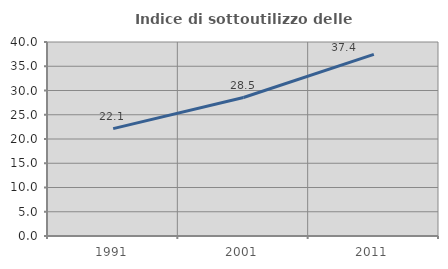
| Category | Indice di sottoutilizzo delle abitazioni  |
|---|---|
| 1991.0 | 22.139 |
| 2001.0 | 28.548 |
| 2011.0 | 37.448 |